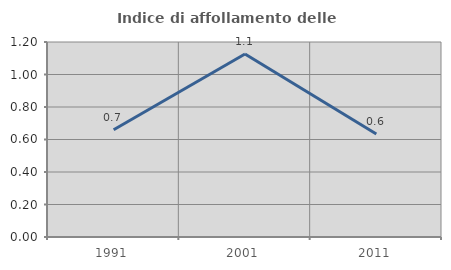
| Category | Indice di affollamento delle abitazioni  |
|---|---|
| 1991.0 | 0.66 |
| 2001.0 | 1.126 |
| 2011.0 | 0.634 |